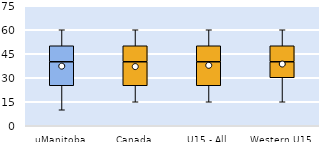
| Category | 25th | 50th | 75th |
|---|---|---|---|
| uManitoba | 25 | 15 | 10 |
| Canada | 25 | 15 | 10 |
| U15 - All | 25 | 15 | 10 |
| Western U15 | 30 | 10 | 10 |